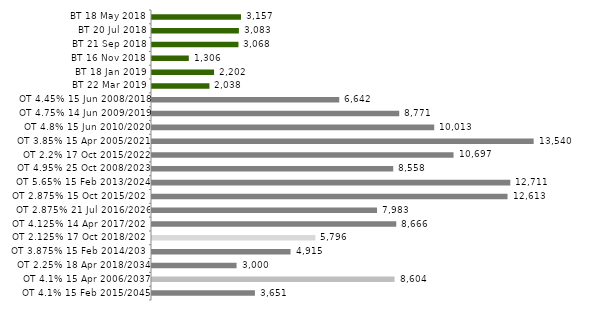
| Category | Series 0 |
|---|---|
| BT 18 May 2018 | 3157.044 |
| BT 20 Jul 2018 | 3083.1 |
| BT 21 Sep 2018 | 3067.708 |
| BT 16 Nov 2018 | 1306.301 |
| BT 18 Jan 2019 | 2202.05 |
| BT 22 Mar 2019 | 2037.526 |
| OT 4.45% 15 Jun 2008/2018 | 6642.44 |
| OT 4.75% 14 Jun 2009/2019 | 8770.58 |
| OT 4.8% 15 Jun 2010/2020 | 10012.658 |
| OT 3.85% 15 Apr 2005/2021 | 13539.958 |
| OT 2.2% 17 Oct 2015/2022 | 10697.462 |
| OT 4.95% 25 Oct 2008/2023 | 8557.734 |
| OT 5.65% 15 Feb 2013/2024 | 12711.355 |
| OT 2.875% 15 Oct 2015/2025 | 12613.263 |
| OT 2.875% 21 Jul 2016/2026 | 7982.982 |
| OT 4.125% 14 Apr 2017/2027 | 8665.841 |
| OT 2.125% 17 Oct 2018/2028 | 5796.042 |
| OT 3.875% 15 Feb 2014/2030 | 4914.902 |
| OT 2.25% 18 Apr 2018/2034 | 3000 |
| OT 4.1% 15 Apr 2006/2037 | 8604.325 |
| OT 4.1% 15 Feb 2015/2045 | 3650.935 |